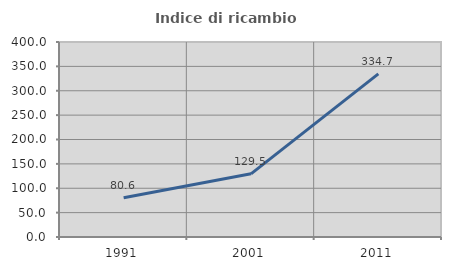
| Category | Indice di ricambio occupazionale  |
|---|---|
| 1991.0 | 80.631 |
| 2001.0 | 129.545 |
| 2011.0 | 334.667 |